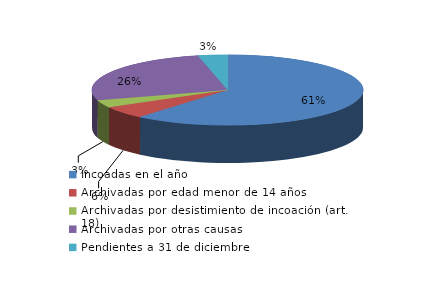
| Category | Series 0 |
|---|---|
| Incoadas en el año | 3463 |
| Archivadas por edad menor de 14 años | 326 |
| Archivadas por desistimiento de incoación (art. 18) | 196 |
| Archivadas por otras causas | 1483 |
| Pendientes a 31 de diciembre | 198 |